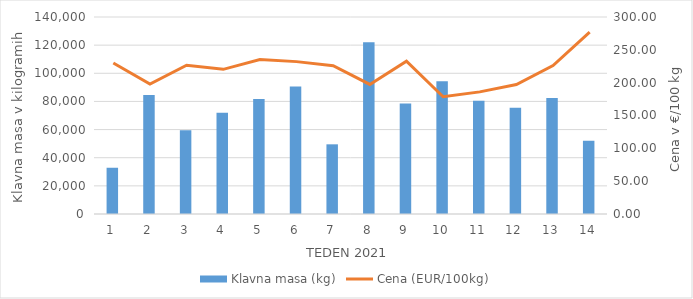
| Category | Klavna masa (kg) |
|---|---|
| 1.0 | 32871 |
| 2.0 | 84639 |
| 3.0 | 59476 |
| 4.0 | 72013 |
| 5.0 | 81759 |
| 6.0 | 90669 |
| 7.0 | 49517 |
| 8.0 | 122111 |
| 9.0 | 78545 |
| 10.0 | 94384 |
| 11.0 | 80405 |
| 12.0 | 75534 |
| 13.0 | 82440 |
| 14.0 | 52143 |